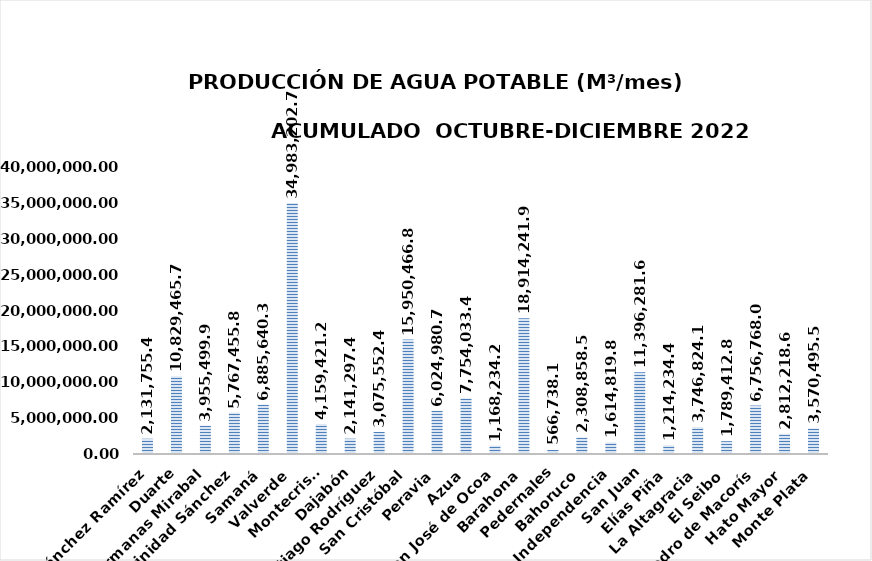
| Category | 2,131,755.47 |
|---|---|
| Sánchez Ramírez | 2131755.472 |
| Duarte | 10829465.792 |
| Hermanas Mirabal | 3955499.992 |
| María Trinidad Sánchez | 5767455.856 |
| Samaná | 6885640.348 |
| Valverde | 34983202.752 |
| Montecristi | 4159421.28 |
| Dajabón | 2141297.406 |
| Santiago Rodríguez | 3075552.464 |
| San Cristóbal | 15950466.867 |
| Peravia | 6024980.698 |
| Azua | 7754033.468 |
| San José de Ocoa | 1168234.276 |
| Barahona | 18914241.98 |
| Pedernales | 566738.19 |
| Bahoruco | 2308858.56 |
| Independencia | 1614819.859 |
| San Juan | 11396281.652 |
| Elías Piña | 1214234.42 |
| La Altagracia | 3746824.128 |
| El Seibo | 1789412.826 |
| San Pedro de Macorís | 6756768 |
| Hato Mayor | 2812218.624 |
| Monte Plata | 3570495.552 |